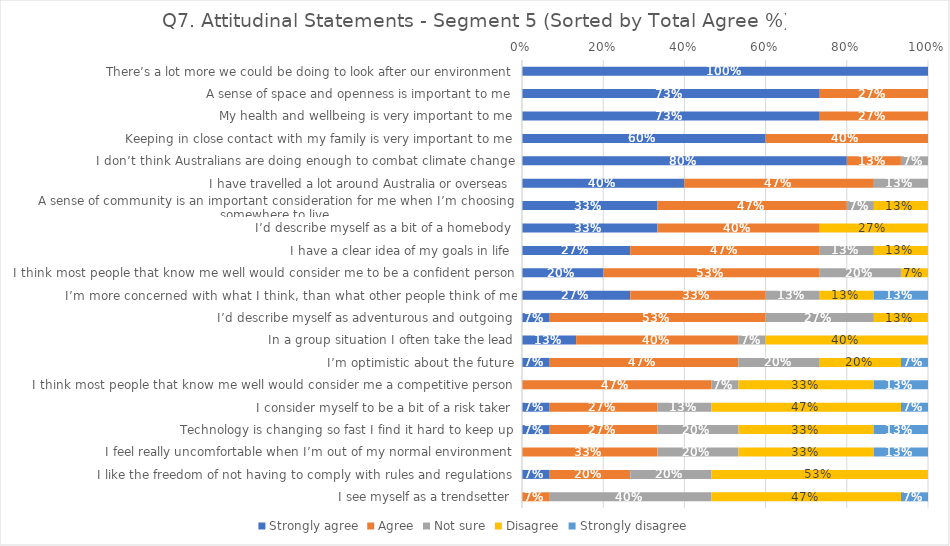
| Category | Strongly agree | Agree | Not sure | Disagree | Strongly disagree |
|---|---|---|---|---|---|
| There’s a lot more we could be doing to look after our environment | 1 | 0 | 0 | 0 | 0 |
| A sense of space and openness is important to me | 0.733 | 0.267 | 0 | 0 | 0 |
| My health and wellbeing is very important to me | 0.733 | 0.267 | 0 | 0 | 0 |
| Keeping in close contact with my family is very important to me | 0.6 | 0.4 | 0 | 0 | 0 |
| I don’t think Australians are doing enough to combat climate change | 0.8 | 0.133 | 0.067 | 0 | 0 |
| I have travelled a lot around Australia or overseas | 0.4 | 0.467 | 0.133 | 0 | 0 |
| A sense of community is an important consideration for me when I’m choosing somewhere to live | 0.333 | 0.467 | 0.067 | 0.133 | 0 |
| I’d describe myself as a bit of a homebody | 0.333 | 0.4 | 0 | 0.267 | 0 |
| I have a clear idea of my goals in life | 0.267 | 0.467 | 0.133 | 0.133 | 0 |
| I think most people that know me well would consider me to be a confident person | 0.2 | 0.533 | 0.2 | 0.067 | 0 |
| I’m more concerned with what I think, than what other people think of me | 0.267 | 0.333 | 0.133 | 0.133 | 0.133 |
| I’d describe myself as adventurous and outgoing | 0.067 | 0.533 | 0.267 | 0.133 | 0 |
| In a group situation I often take the lead | 0.133 | 0.4 | 0.067 | 0.4 | 0 |
| I’m optimistic about the future | 0.067 | 0.467 | 0.2 | 0.2 | 0.067 |
| I think most people that know me well would consider me a competitive person | 0 | 0.467 | 0.067 | 0.333 | 0.133 |
| I consider myself to be a bit of a risk taker | 0.067 | 0.267 | 0.133 | 0.467 | 0.067 |
| Technology is changing so fast I find it hard to keep up | 0.067 | 0.267 | 0.2 | 0.333 | 0.133 |
| I feel really uncomfortable when I’m out of my normal environment | 0 | 0.333 | 0.2 | 0.333 | 0.133 |
| I like the freedom of not having to comply with rules and regulations | 0.067 | 0.2 | 0.2 | 0.533 | 0 |
| I see myself as a trendsetter | 0 | 0.067 | 0.4 | 0.467 | 0.067 |